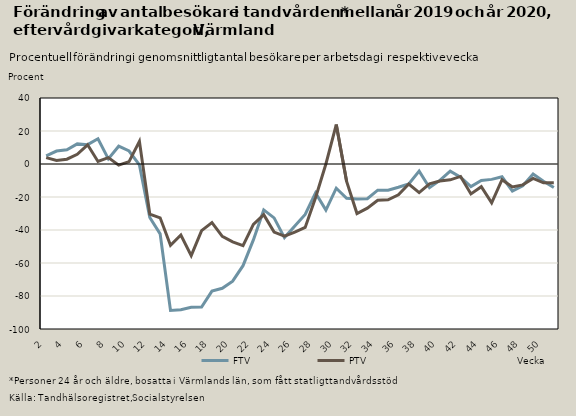
| Category | FTV | PTV |
|---|---|---|
| 2.0 | 4.921 | 3.88 |
| 3.0 | 7.835 | 2.144 |
| 4.0 | 8.613 | 2.906 |
| 5.0 | 12.181 | 5.852 |
| 6.0 | 11.713 | 11.633 |
| 7.0 | 15.273 | 1.526 |
| 8.0 | 3.121 | 3.881 |
| 9.0 | 10.795 | -0.689 |
| 10.0 | 7.881 | 1.473 |
| 11.0 | -0.57 | 13.73 |
| 12.0 | -32.447 | -30.328 |
| 13.0 | -42.325 | -32.621 |
| 14.0 | -88.729 | -49.322 |
| 15.0 | -88.297 | -43.025 |
| 16.0 | -86.846 | -55.516 |
| 17.0 | -86.642 | -40.412 |
| 18.0 | -77.063 | -35.526 |
| 19.0 | -75.327 | -43.832 |
| 20.0 | -71.028 | -47.216 |
| 21.0 | -61.62 | -49.442 |
| 22.0 | -45.986 | -36.589 |
| 23.0 | -27.824 | -30.682 |
| 24.0 | -32.651 | -41.255 |
| 25.0 | -44.597 | -43.718 |
| 26.0 | -37.625 | -41.266 |
| 27.0 | -30.612 | -38.409 |
| 28.0 | -17.528 | -20.417 |
| 29.0 | -27.964 | 0 |
| 30.0 | -14.668 | 23.881 |
| 31.0 | -20.787 | -10.571 |
| 32.0 | -21.209 | -30.019 |
| 33.0 | -21.068 | -26.768 |
| 34.0 | -15.859 | -21.939 |
| 35.0 | -15.908 | -21.738 |
| 36.0 | -14.111 | -18.649 |
| 37.0 | -12.048 | -12.113 |
| 38.0 | -4.304 | -17.352 |
| 39.0 | -14.369 | -12.024 |
| 40.0 | -9.915 | -10.339 |
| 41.0 | -4.364 | -9.612 |
| 42.0 | -8.024 | -7.539 |
| 43.0 | -13.664 | -18.12 |
| 44.0 | -10.031 | -13.768 |
| 45.0 | -9.325 | -23.517 |
| 46.0 | -7.756 | -9.54 |
| 47.0 | -16.409 | -13.938 |
| 48.0 | -13.182 | -12.642 |
| 49.0 | -6.1 | -8.776 |
| 50.0 | -10.422 | -11.399 |
| 51.0 | -14.286 | -11.349 |